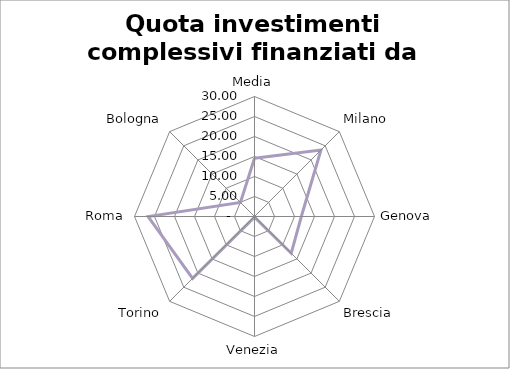
| Category | Quota investimenti complessivi finanziati da debito |
|---|---|
| Media | 14.543 |
| Milano | 23.5 |
| Genova | 11.71 |
| Brescia | 12.99 |
| Venezia | 0.15 |
| Torino | 21.89 |
| Roma | 26.59 |
| Bologna | 4.97 |